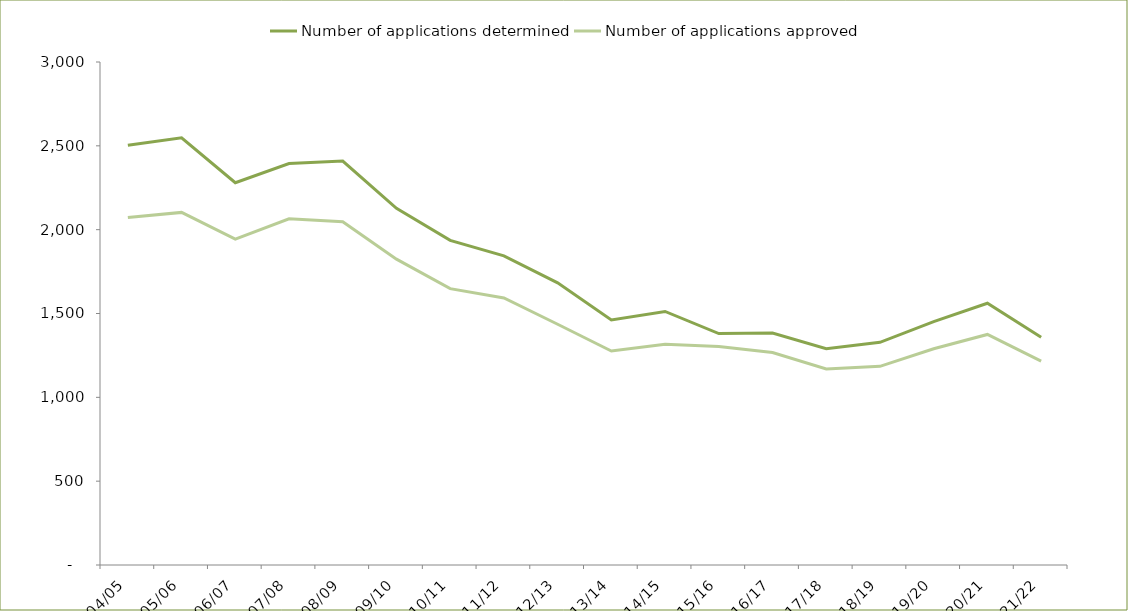
| Category | Number of applications determined | Number of applications approved |
|---|---|---|
| 2004/05 | 2503 | 2072 |
| 2005/06 | 2548 | 2103 |
| 2006/07 | 2280 | 1944 |
| 2007/08 | 2394 | 2065 |
| 2008/09 | 2409 | 2047 |
| 2009/10 | 2127 | 1824 |
| 2010/11 | 1936 | 1648 |
| 2011/12 | 1844 | 1593 |
| 2012/13 | 1683 | 1436 |
| 2013/14 | 1461 | 1276 |
| 2014/15 | 1512 | 1317 |
| 2015/16 | 1380 | 1303 |
| 2016/17 | 1383 | 1267 |
| 2017/18 | 1290 | 1169 |
| 2018/19 | 1328 | 1185 |
| 2019/20 | 1452 | 1290 |
| 2020/21 | 1561 | 1375 |
| 2021/22 | 1358 | 1216 |